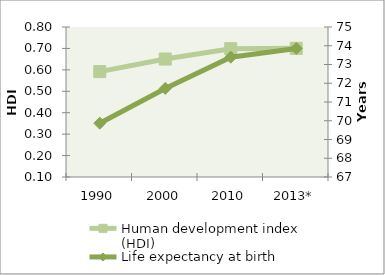
| Category | Human development index (HDI) |
|---|---|
| 1990 | 0.592 |
| 2000 | 0.65 |
| 2010 | 0.699 |
| 2013* | 0.7 |